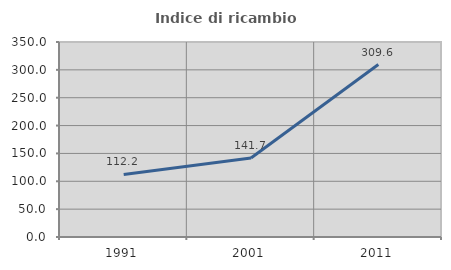
| Category | Indice di ricambio occupazionale  |
|---|---|
| 1991.0 | 112.208 |
| 2001.0 | 141.71 |
| 2011.0 | 309.585 |